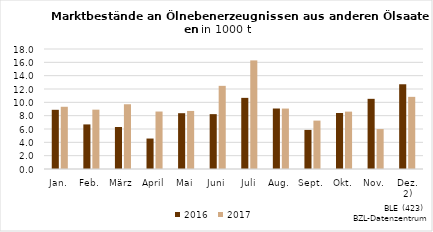
| Category | 2016 | 2017 |
|---|---|---|
| Jan. | 8.88 | 9.334 |
| Feb. | 6.688 | 8.902 |
| März | 6.301 | 9.713 |
| April | 4.569 | 8.621 |
| Mai | 8.37 | 8.709 |
| Juni | 8.229 | 12.473 |
| Juli | 10.671 | 16.29 |
| Aug. | 9.074 | 9.066 |
| Sept. | 5.863 | 7.258 |
| Okt. | 8.401 | 8.606 |
| Nov. | 10.525 | 5.99 |
| Dez. 2) | 12.71 | 10.822 |